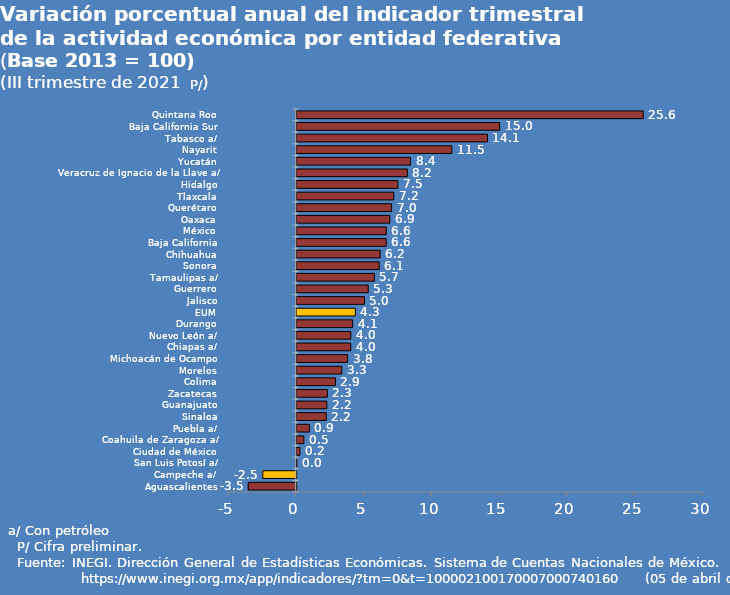
| Category | Series 0 |
|---|---|
| Aguascalientes | -3.541 |
| Campeche a/ | -2.463 |
| San Luis Potosí a/ | 0.017 |
| Ciudad de México | 0.236 |
| Coahuila de Zaragoza a/ | 0.527 |
| Puebla a/ | 0.935 |
| Sinaloa | 2.183 |
| Guanajuato | 2.222 |
| Zacatecas | 2.264 |
| Colima | 2.859 |
| Morelos | 3.333 |
| Michoacán de Ocampo | 3.753 |
| Chiapas a/ | 3.989 |
| Nuevo León a/ | 3.994 |
| Durango | 4.13 |
| EUM | 4.329 |
| Jalisco | 5.003 |
| Guerrero | 5.28 |
| Tamaulipas a/ | 5.737 |
| Sonora | 6.09 |
| Chihuahua | 6.162 |
| Baja California | 6.608 |
| México | 6.609 |
| Oaxaca | 6.875 |
| Querétaro | 7.004 |
| Tlaxcala | 7.168 |
| Hidalgo | 7.467 |
| Veracruz de Ignacio de la Llave a/ | 8.17 |
| Yucatán | 8.403 |
| Nayarit | 11.46 |
| Tabasco a/ | 14.086 |
| Baja California Sur | 14.986 |
| Quintana Roo | 25.584 |